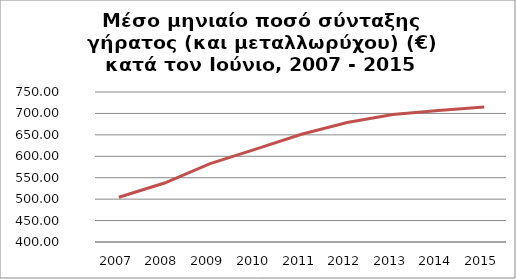
| Category | Series 1 |
|---|---|
| 2007.0 | 504.426 |
| 2008.0 | 537.591 |
| 2009.0 | 582.94 |
| 2010.0 | 616.567 |
| 2011.0 | 651.509 |
| 2012.0 | 678.951 |
| 2013.0 | 697.458 |
| 2014.0 | 707.063 |
| 2015.0 | 715.126 |